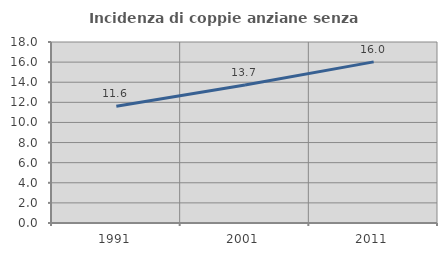
| Category | Incidenza di coppie anziane senza figli  |
|---|---|
| 1991.0 | 11.621 |
| 2001.0 | 13.72 |
| 2011.0 | 16.024 |